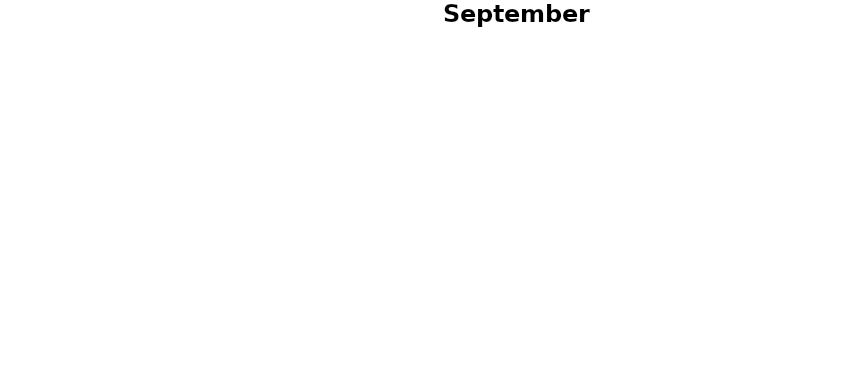
| Category | septembre 2013 |
|---|---|
| Mme D'Harcourt | 0 |
| Mme Bertrand | 0 |
| Mlle Vanthomme | 0 |
| Mme Tercinier | 0 |
| Mme De Vilelle | 0 |
| Mme Salmon | 0 |